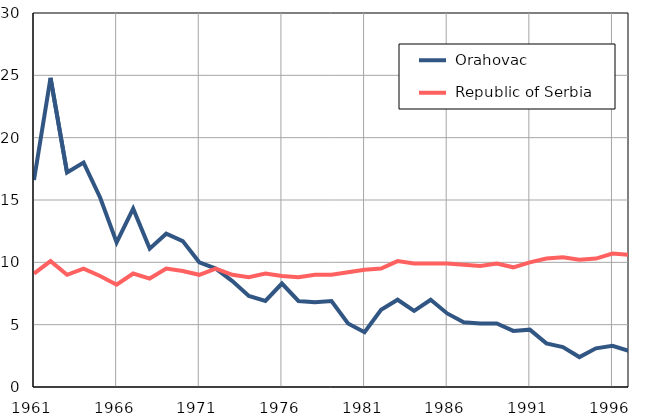
| Category |  Orahovac |  Republic of Serbia |
|---|---|---|
| 1961.0 | 16.6 | 9.1 |
| 1962.0 | 24.8 | 10.1 |
| 1963.0 | 17.2 | 9 |
| 1964.0 | 18 | 9.5 |
| 1965.0 | 15.2 | 8.9 |
| 1966.0 | 11.6 | 8.2 |
| 1967.0 | 14.3 | 9.1 |
| 1968.0 | 11.1 | 8.7 |
| 1969.0 | 12.3 | 9.5 |
| 1970.0 | 11.7 | 9.3 |
| 1971.0 | 10 | 9 |
| 1972.0 | 9.5 | 9.5 |
| 1973.0 | 8.5 | 9 |
| 1974.0 | 7.3 | 8.8 |
| 1975.0 | 6.9 | 9.1 |
| 1976.0 | 8.3 | 8.9 |
| 1977.0 | 6.9 | 8.8 |
| 1978.0 | 6.8 | 9 |
| 1979.0 | 6.9 | 9 |
| 1980.0 | 5.1 | 9.2 |
| 1981.0 | 4.4 | 9.4 |
| 1982.0 | 6.2 | 9.5 |
| 1983.0 | 7 | 10.1 |
| 1984.0 | 6.1 | 9.9 |
| 1985.0 | 7 | 9.9 |
| 1986.0 | 5.9 | 9.9 |
| 1987.0 | 5.2 | 9.8 |
| 1988.0 | 5.1 | 9.7 |
| 1989.0 | 5.1 | 9.9 |
| 1990.0 | 4.5 | 9.6 |
| 1991.0 | 4.6 | 10 |
| 1992.0 | 3.5 | 10.3 |
| 1993.0 | 3.2 | 10.4 |
| 1994.0 | 2.4 | 10.2 |
| 1995.0 | 3.1 | 10.3 |
| 1996.0 | 3.3 | 10.7 |
| 1997.0 | 2.9 | 10.6 |